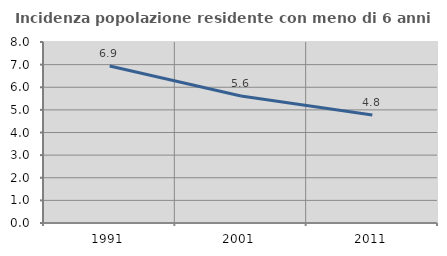
| Category | Incidenza popolazione residente con meno di 6 anni |
|---|---|
| 1991.0 | 6.941 |
| 2001.0 | 5.613 |
| 2011.0 | 4.777 |